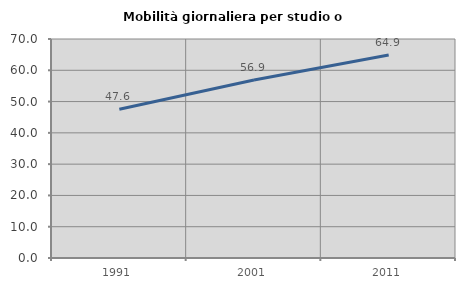
| Category | Mobilità giornaliera per studio o lavoro |
|---|---|
| 1991.0 | 47.558 |
| 2001.0 | 56.874 |
| 2011.0 | 64.872 |